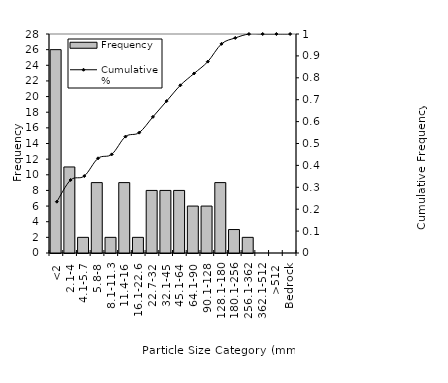
| Category | Frequency |
|---|---|
| <2 | 26 |
| 2.1-4 | 11 |
| 4.1-5.7 | 2 |
| 5.8-8 | 9 |
| 8.1-11.3 | 2 |
| 11.4-16 | 9 |
| 16.1-22.6 | 2 |
| 22.7-32 | 8 |
| 32.1-45 | 8 |
| 45.1-64 | 8 |
| 64.1-90 | 6 |
| 90.1-128 | 6 |
| 128.1-180 | 9 |
| 180.1-256 | 3 |
| 256.1-362 | 2 |
| 362.1-512 | 0 |
| >512 | 0 |
| Bedrock | 0 |